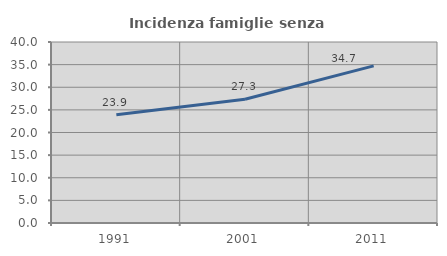
| Category | Incidenza famiglie senza nuclei |
|---|---|
| 1991.0 | 23.902 |
| 2001.0 | 27.343 |
| 2011.0 | 34.721 |